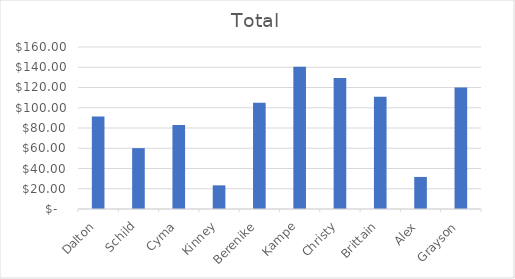
| Category | Total |
|---|---|
| Dalton | 91.43 |
| Schild | 60.12 |
| Cyma | 82.88 |
| Kinney | 23.36 |
| Berenike | 104.95 |
| Kampe | 140.4 |
| Christy | 129.4 |
| Brittain | 110.76 |
| Alex | 31.68 |
| Grayson | 119.88 |